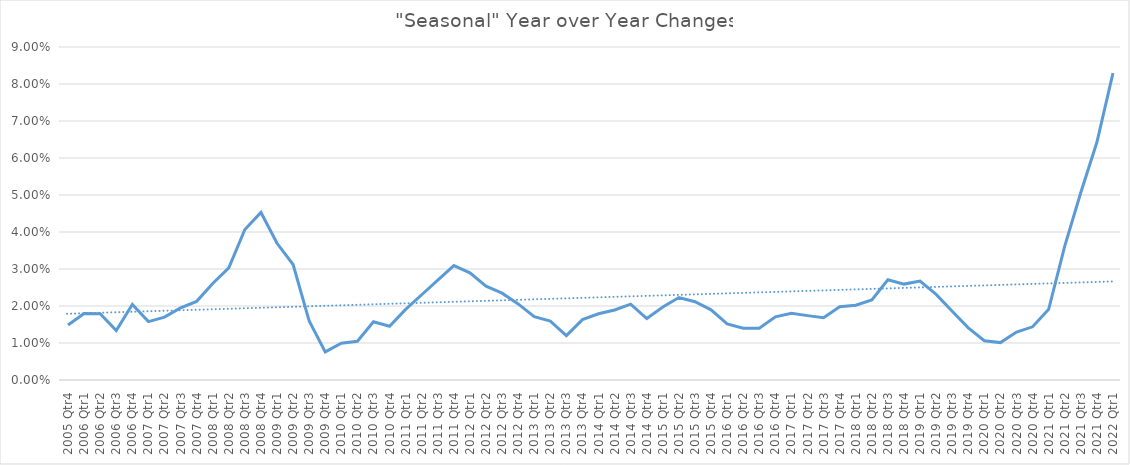
| Category | "Seasonal" Year over Year Changes |
|---|---|
| 2005 Qtr4 | 0.015 |
| 2006 Qtr1 | 0.018 |
| 2006 Qtr2 | 0.018 |
| 2006 Qtr3 | 0.013 |
| 2006 Qtr4 | 0.02 |
| 2007 Qtr1 | 0.016 |
| 2007 Qtr2 | 0.017 |
| 2007 Qtr3 | 0.019 |
| 2007 Qtr4 | 0.021 |
| 2008 Qtr1 | 0.026 |
| 2008 Qtr2 | 0.03 |
| 2008 Qtr3 | 0.041 |
| 2008 Qtr4 | 0.045 |
| 2009 Qtr1 | 0.037 |
| 2009 Qtr2 | 0.031 |
| 2009 Qtr3 | 0.016 |
| 2009 Qtr4 | 0.008 |
| 2010 Qtr1 | 0.01 |
| 2010 Qtr2 | 0.01 |
| 2010 Qtr3 | 0.016 |
| 2010 Qtr4 | 0.015 |
| 2011 Qtr1 | 0.019 |
| 2011 Qtr2 | 0.023 |
| 2011 Qtr3 | 0.027 |
| 2011 Qtr4 | 0.031 |
| 2012 Qtr1 | 0.029 |
| 2012 Qtr2 | 0.025 |
| 2012 Qtr3 | 0.023 |
| 2012 Qtr4 | 0.021 |
| 2013 Qtr1 | 0.017 |
| 2013 Qtr2 | 0.016 |
| 2013 Qtr3 | 0.012 |
| 2013 Qtr4 | 0.016 |
| 2014 Qtr1 | 0.018 |
| 2014 Qtr2 | 0.019 |
| 2014 Qtr3 | 0.02 |
| 2014 Qtr4 | 0.017 |
| 2015 Qtr1 | 0.02 |
| 2015 Qtr2 | 0.022 |
| 2015 Qtr3 | 0.021 |
| 2015 Qtr4 | 0.019 |
| 2016 Qtr1 | 0.015 |
| 2016 Qtr2 | 0.014 |
| 2016 Qtr3 | 0.014 |
| 2016 Qtr4 | 0.017 |
| 2017 Qtr1 | 0.018 |
| 2017 Qtr2 | 0.017 |
| 2017 Qtr3 | 0.017 |
| 2017 Qtr4 | 0.02 |
| 2018 Qtr1 | 0.02 |
| 2018 Qtr2 | 0.022 |
| 2018 Qtr3 | 0.027 |
| 2018 Qtr4 | 0.026 |
| 2019 Qtr1 | 0.027 |
| 2019 Qtr2 | 0.023 |
| 2019 Qtr3 | 0.019 |
| 2019 Qtr4 | 0.014 |
| 2020 Qtr1 | 0.011 |
| 2020 Qtr2 | 0.01 |
| 2020 Qtr3 | 0.013 |
| 2020 Qtr4 | 0.014 |
| 2021 Qtr1 | 0.019 |
| 2021 Qtr2 | 0.036 |
| 2021 Qtr3 | 0.051 |
| 2021 Qtr4 | 0.064 |
| 2022 Qtr1 | 0.083 |